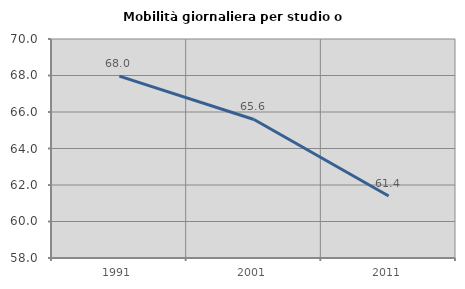
| Category | Mobilità giornaliera per studio o lavoro |
|---|---|
| 1991.0 | 67.965 |
| 2001.0 | 65.591 |
| 2011.0 | 61.395 |